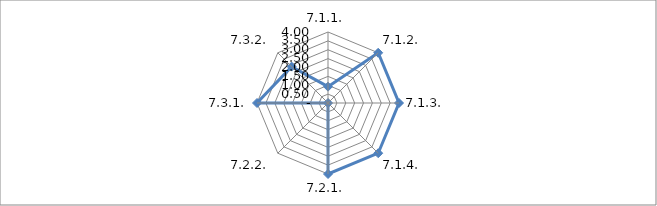
| Category | Series 0 |
|---|---|
| 7.1.1. | 0.92 |
| 7.1.2. | 4 |
| 7.1.3. | 4 |
| 7.1.4. | 4 |
| 7.2.1. | 4 |
| 7.2.2. | 0 |
| 7.3.1. | 4 |
| 7.3.2. | 2.9 |